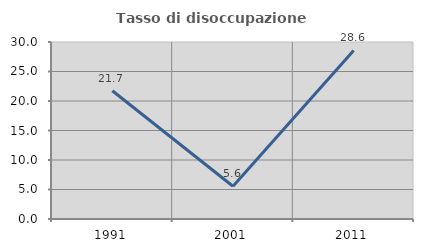
| Category | Tasso di disoccupazione giovanile  |
|---|---|
| 1991.0 | 21.739 |
| 2001.0 | 5.556 |
| 2011.0 | 28.571 |